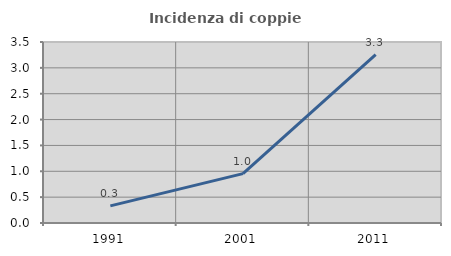
| Category | Incidenza di coppie miste |
|---|---|
| 1991.0 | 0.331 |
| 2001.0 | 0.955 |
| 2011.0 | 3.254 |